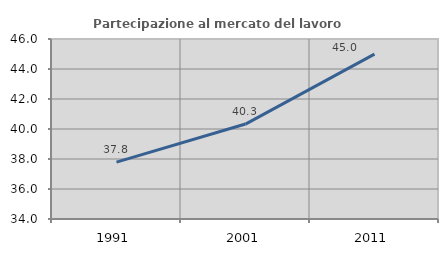
| Category | Partecipazione al mercato del lavoro  femminile |
|---|---|
| 1991.0 | 37.79 |
| 2001.0 | 40.33 |
| 2011.0 | 44.994 |